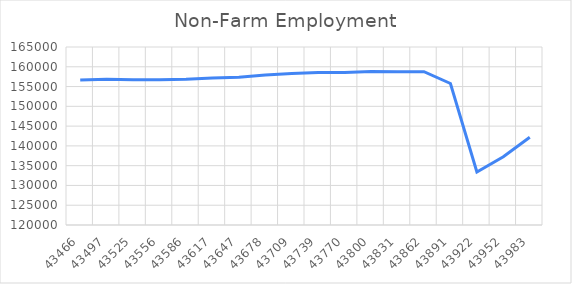
| Category | Series 0 |
|---|---|
| 43466.0 | 156627 |
| 43497.0 | 156866 |
| 43525.0 | 156741 |
| 43556.0 | 156696 |
| 43586.0 | 156844 |
| 43617.0 | 157148 |
| 43647.0 | 157346 |
| 43678.0 | 157895 |
| 43709.0 | 158298 |
| 43739.0 | 158544 |
| 43770.0 | 158536 |
| 43800.0 | 158803 |
| 43831.0 | 158714 |
| 43862.0 | 158759 |
| 43891.0 | 155772 |
| 43922.0 | 133403 |
| 43952.0 | 137242 |
| 43983.0 | 142182 |